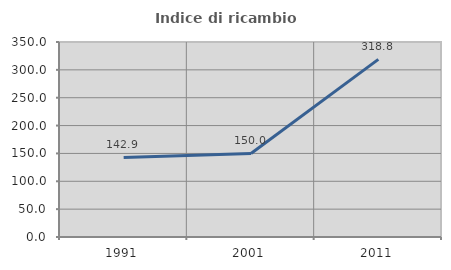
| Category | Indice di ricambio occupazionale  |
|---|---|
| 1991.0 | 142.857 |
| 2001.0 | 150 |
| 2011.0 | 318.75 |